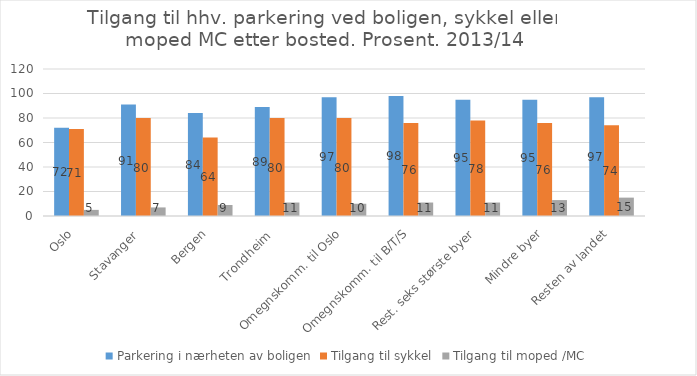
| Category | Parkering i nærheten av boligen | Tilgang til sykkel | Tilgang til moped /MC |
|---|---|---|---|
| Oslo | 72 | 71 | 5 |
| Stavanger  | 91 | 80 | 7 |
| Bergen | 84 | 64 | 9 |
| Trondheim  | 89 | 80 | 11 |
| Omegnskomm. til Oslo | 97 | 80 | 10 |
| Omegnskomm. til B/T/S | 98 | 76 | 11 |
| Rest. seks største byer | 95 | 78 | 11 |
| Mindre byer | 95 | 76 | 13 |
| Resten av landet | 97 | 74 | 15 |